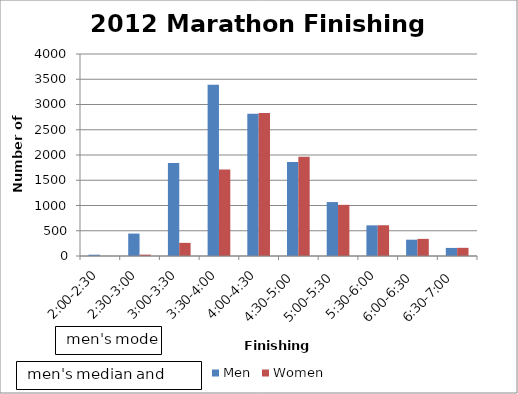
| Category | Men | Women |
|---|---|---|
| 2:00-2:30 | 26 | 1 |
| 2:30-3:00 | 444 | 27 |
| 3:00-3:30 | 1844 | 260 |
| 3:30-4:00 | 3389 | 1714 |
| 4:00-4:30 | 2819 | 2833 |
| 4:30-5:00  | 1861 | 1966 |
| 5:00-5:30  | 1068 | 1013 |
| 5:30-6:00 | 607 | 609 |
| 6:00-6:30  | 323 | 339 |
| 6:30-7:00  | 160 | 162 |